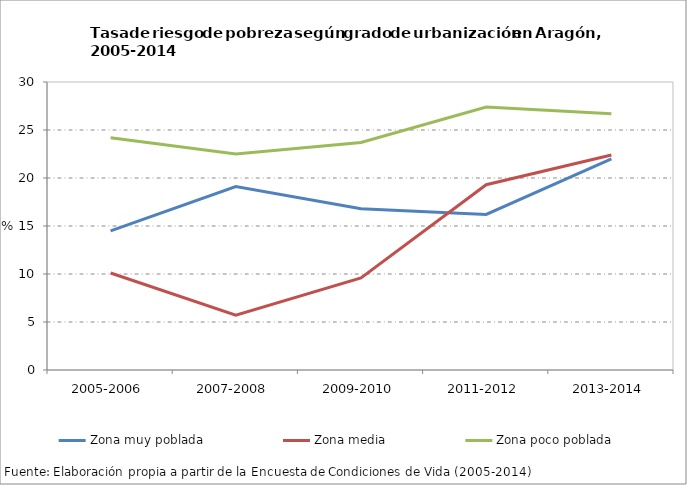
| Category | Zona muy poblada | Zona media | Zona poco poblada |
|---|---|---|---|
| 2005-2006 | 14.5 | 10.1 | 24.2 |
| 2007-2008 | 19.1 | 5.7 | 22.5 |
| 2009-2010 | 16.8 | 9.6 | 23.7 |
| 2011-2012 | 16.2 | 19.3 | 27.4 |
| 2013-2014 | 22 | 22.4 | 26.7 |